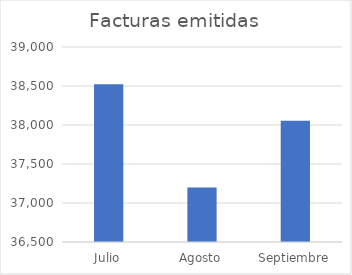
| Category | Facturas emitidas |
|---|---|
| Julio | 38522 |
| Agosto | 37200 |
| Septiembre | 38056 |